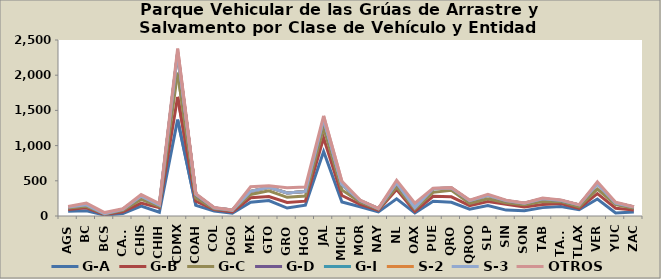
| Category | G-A | G-B | G-C | G-D | G-I | S-2 | S-3 | OTROS |
|---|---|---|---|---|---|---|---|---|
| AGS | 68 | 24 | 21 | 14 | 1 | 0 | 0 | 6 |
| BC | 74 | 43 | 20 | 21 | 0 | 1 | 0 | 25 |
| BCS | 13 | 8 | 8 | 4 | 1 | 0 | 0 | 15 |
| CAMP | 34 | 24 | 23 | 13 | 1 | 0 | 0 | 8 |
| CHIS | 140 | 43 | 52 | 47 | 0 | 0 | 0 | 22 |
| CHIH | 53 | 64 | 19 | 21 | 0 | 0 | 0 | 18 |
| CDMX | 1369 | 323 | 344 | 278 | 6 | 1 | 0 | 56 |
| COAH | 150 | 60 | 44 | 47 | 6 | 0 | 0 | 9 |
| COL | 72 | 18 | 13 | 11 | 0 | 1 | 0 | 6 |
| DGO | 39 | 19 | 21 | 5 | 0 | 0 | 0 | 2 |
| MEX | 197 | 63 | 46 | 42 | 3 | 0 | 0 | 64 |
| GTO | 219 | 57 | 83 | 48 | 1 | 0 | 0 | 20 |
| GRO | 113 | 79 | 73 | 61 | 1 | 0 | 0 | 73 |
| HGO | 153 | 58 | 72 | 65 | 1 | 0 | 0 | 63 |
| JAL | 917 | 192 | 143 | 118 | 5 | 2 | 0 | 46 |
| MICH | 198 | 93 | 80 | 74 | 0 | 3 | 0 | 45 |
| MOR | 131 | 33 | 34 | 20 | 1 | 0 | 0 | 7 |
| NAY | 59 | 23 | 15 | 9 | 0 | 0 | 0 | 2 |
| NL | 244 | 132 | 36 | 52 | 7 | 0 | 0 | 36 |
| OAX | 43 | 21 | 36 | 20 | 0 | 0 | 0 | 63 |
| PUE | 209 | 70 | 57 | 51 | 1 | 1 | 2 | 4 |
| QRO | 194 | 78 | 93 | 33 | 0 | 0 | 0 | 5 |
| QROO | 97 | 49 | 34 | 36 | 1 | 0 | 0 | 9 |
| SLP | 150 | 55 | 40 | 49 | 1 | 0 | 0 | 14 |
| SIN | 84 | 83 | 21 | 24 | 5 | 0 | 1 | 7 |
| SON | 76 | 51 | 32 | 22 | 0 | 0 | 0 | 3 |
| TAB | 119 | 45 | 43 | 38 | 0 | 0 | 0 | 11 |
| TAMS | 134 | 42 | 28 | 17 | 0 | 1 | 0 | 7 |
| TLAX | 89 | 19 | 24 | 26 | 0 | 0 | 0 | 4 |
| VER | 241 | 76 | 65 | 75 | 0 | 1 | 0 | 27 |
| YUC | 44 | 67 | 52 | 21 | 0 | 0 | 0 | 12 |
| ZAC | 56 | 29 | 25 | 17 | 0 | 2 | 0 | 3 |